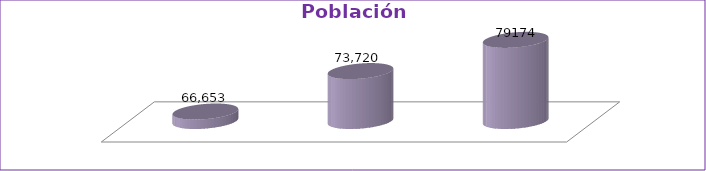
| Category | Población Total |
|---|---|
| 1993 | 66653 |
| 2005 | 73720 |
| 2018 | 79174 |